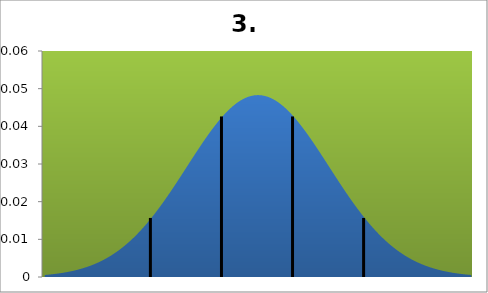
| Category | densité |
|---|---|
| 0.8400000000000034 | 0.001 |
| 1.2530000000000037 | 0.001 |
| 1.6660000000000004 | 0.001 |
| 2.0790000000000006 | 0.001 |
| 2.492000000000001 | 0.001 |
| 2.905000000000001 | 0.001 |
| 3.3180000000000014 | 0.001 |
| 3.7310000000000016 | 0.001 |
| 4.144000000000002 | 0.002 |
| 4.557000000000002 | 0.002 |
| 4.970000000000002 | 0.002 |
| 5.382999999999999 | 0.002 |
| 5.795999999999999 | 0.003 |
| 6.209000000000003 | 0.003 |
| 6.622000000000003 | 0.003 |
| 7.035 | 0.004 |
| 7.448 | 0.004 |
| 7.861000000000001 | 0.005 |
| 8.274000000000001 | 0.005 |
| 8.687000000000001 | 0.006 |
| 9.100000000000001 | 0.007 |
| 9.513000000000002 | 0.007 |
| 9.926000000000002 | 0.008 |
| 10.339 | 0.009 |
| 10.752 | 0.01 |
| 11.165000000000003 | 0.01 |
| 11.578000000000003 | 0.011 |
| 11.991000000000001 | 0.012 |
| 12.404000000000002 | 0.013 |
| 12.817 | 0.015 |
| 13.230000000000002 | 0.016 |
| 13.643 | 0.017 |
| 14.056000000000001 | 0.018 |
| 14.469000000000001 | 0.019 |
| 14.882000000000001 | 0.021 |
| 15.295000000000002 | 0.022 |
| 15.708 | 0.024 |
| 16.121000000000002 | 0.025 |
| 16.534 | 0.026 |
| 16.947000000000003 | 0.028 |
| 17.36 | 0.029 |
| 17.773000000000003 | 0.031 |
| 18.186 | 0.032 |
| 18.599000000000004 | 0.034 |
| 19.012 | 0.035 |
| 19.425 | 0.036 |
| 19.838 | 0.038 |
| 20.251 | 0.039 |
| 20.664 | 0.04 |
| 21.077 | 0.042 |
| 21.490000000000002 | 0.043 |
| 21.903000000000002 | 0.044 |
| 22.316000000000003 | 0.045 |
| 22.729 | 0.045 |
| 23.142 | 0.046 |
| 23.555 | 0.047 |
| 23.968 | 0.047 |
| 24.381 | 0.048 |
| 24.794 | 0.048 |
| 25.207 | 0.048 |
| 25.62 | 0.048 |
| 26.033 | 0.048 |
| 26.446 | 0.048 |
| 26.859 | 0.048 |
| 27.272000000000002 | 0.047 |
| 27.685000000000002 | 0.047 |
| 28.098000000000003 | 0.046 |
| 28.511000000000003 | 0.045 |
| 28.924 | 0.045 |
| 29.337 | 0.044 |
| 29.75 | 0.043 |
| 30.163 | 0.042 |
| 30.576 | 0.04 |
| 30.989 | 0.039 |
| 31.402 | 0.038 |
| 31.815 | 0.036 |
| 32.228 | 0.035 |
| 32.641 | 0.034 |
| 33.054 | 0.032 |
| 33.467 | 0.031 |
| 33.88 | 0.029 |
| 34.293 | 0.028 |
| 34.706 | 0.026 |
| 35.119 | 0.025 |
| 35.532000000000004 | 0.024 |
| 35.945 | 0.022 |
| 36.358000000000004 | 0.021 |
| 36.771 | 0.019 |
| 37.184 | 0.018 |
| 37.597 | 0.017 |
| 38.01 | 0.016 |
| 38.423 | 0.015 |
| 38.836 | 0.013 |
| 39.249 | 0.012 |
| 39.662 | 0.011 |
| 40.075 | 0.01 |
| 40.488 | 0.01 |
| 40.901 | 0.009 |
| 41.314 | 0.008 |
| 41.727000000000004 | 0.007 |
| 42.14 | 0.007 |
| 42.553 | 0.006 |
| 42.966 | 0.005 |
| 43.379000000000005 | 0.005 |
| 43.792 | 0.004 |
| 44.205 | 0.004 |
| 44.617999999999995 | 0.003 |
| 45.031 | 0.003 |
| 45.444 | 0.003 |
| 45.857 | 0.002 |
| 46.269999999999996 | 0.002 |
| 46.683 | 0.002 |
| 47.096000000000004 | 0.002 |
| 47.509 | 0.001 |
| 47.922 | 0.001 |
| 48.335 | 0.001 |
| 48.748000000000005 | 0.001 |
| 49.161 | 0.001 |
| 49.574 | 0.001 |
| 49.986999999999995 | 0.001 |
| 50.4 | 0.001 |